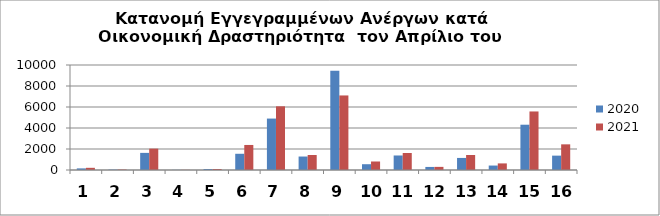
| Category | 2020 | 2021 |
|---|---|---|
| 0 | 154 | 208 |
| 1 | 38 | 47 |
| 2 | 1630 | 2034 |
| 3 | 13 | 16 |
| 4 | 93 | 98 |
| 5 | 1545 | 2385 |
| 6 | 4898 | 6066 |
| 7 | 1283 | 1427 |
| 8 | 9457 | 7100 |
| 9 | 551 | 810 |
| 10 | 1383 | 1620 |
| 11 | 292 | 298 |
| 12 | 1149 | 1430 |
| 13 | 424 | 628 |
| 14 | 4313 | 5575 |
| 15 | 1368 | 2444 |